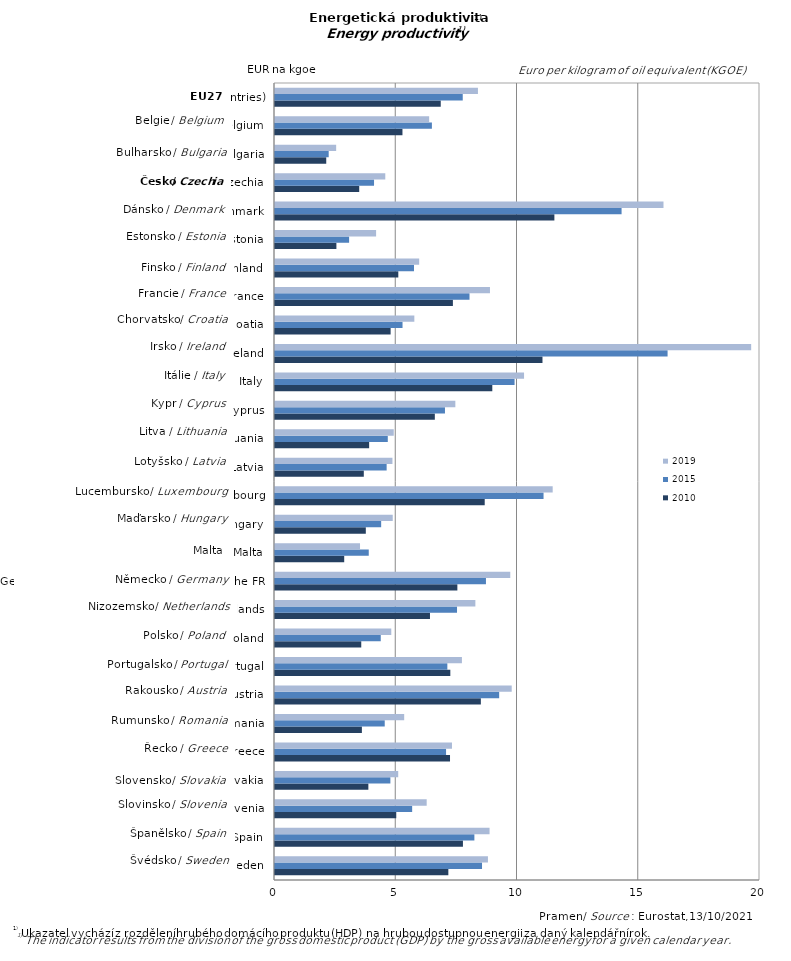
| Category | 2010 | 2015 | 2019 |
|---|---|---|---|
| Sweden | 7.148 | 8.537 | 8.781 |
| Spain | 7.75 | 8.222 | 8.848 |
| Slovenia | 5 | 5.656 | 6.255 |
| Slovakia | 3.85 | 4.758 | 5.081 |
| Greece | 7.217 | 7.054 | 7.298 |
| Romania | 3.583 | 4.525 | 5.327 |
| Austria | 8.489 | 9.244 | 9.761 |
| Portugal | 7.23 | 7.107 | 7.708 |
| Poland | 3.557 | 4.361 | 4.795 |
| Netherlands | 6.391 | 7.506 | 8.263 |
| Germany (until 1990 former territory of the FRG) | 7.52 | 8.699 | 9.702 |
| Malta | 2.854 | 3.866 | 3.506 |
| Hungary | 3.745 | 4.378 | 4.855 |
| Luxembourg | 8.648 | 11.074 | 11.451 |
| Latvia | 3.662 | 4.604 | 4.843 |
| Lithuania | 3.882 | 4.651 | 4.897 |
| Cyprus | 6.591 | 7.009 | 7.437 |
| Italy | 8.961 | 9.879 | 10.27 |
| Ireland | 11.03 | 16.189 | 19.636 |
| Croatia | 4.768 | 5.259 | 5.746 |
| France | 7.336 | 8.021 | 8.865 |
| Finland | 5.085 | 5.732 | 5.946 |
| Estonia | 2.532 | 3.056 | 4.169 |
| Denmark | 11.521 | 14.292 | 16.02 |
| Czechia | 3.473 | 4.084 | 4.548 |
| Bulgaria | 2.113 | 2.214 | 2.522 |
| Belgium | 5.256 | 6.47 | 6.357 |
| EU (27 countries) | 6.835 | 7.742 | 8.369 |